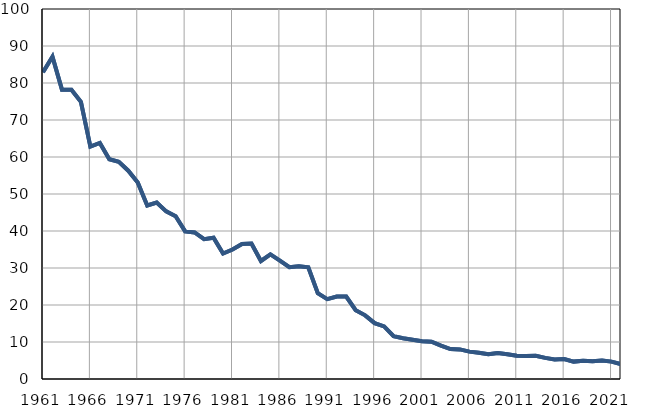
| Category |  РЕПУБЛИКА СРБИЈА |  Република Србија |
|---|---|---|
| 1961.0 | 82.9 | 82.9 |
| 1962.0 | 87.1 | 87.1 |
| 1963.0 | 78.2 | 78.2 |
| 1964.0 | 78.2 | 78.2 |
| 1965.0 | 74.9 | 74.9 |
| 1966.0 | 62.8 | 62.8 |
| 1967.0 | 63.8 | 63.8 |
| 1968.0 | 59.4 | 59.4 |
| 1969.0 | 58.7 | 58.7 |
| 1970.0 | 56.3 | 56.3 |
| 1971.0 | 53.1 | 53.1 |
| 1972.0 | 46.9 | 46.9 |
| 1973.0 | 47.7 | 47.7 |
| 1974.0 | 45.3 | 45.3 |
| 1975.0 | 44 | 44 |
| 1976.0 | 39.9 | 39.9 |
| 1977.0 | 39.6 | 39.6 |
| 1978.0 | 37.8 | 37.8 |
| 1979.0 | 38.2 | 38.2 |
| 1980.0 | 33.9 | 33.9 |
| 1981.0 | 35 | 35 |
| 1982.0 | 36.5 | 36.5 |
| 1983.0 | 36.6 | 36.6 |
| 1984.0 | 31.9 | 31.9 |
| 1985.0 | 33.7 | 33.7 |
| 1986.0 | 32 | 32 |
| 1987.0 | 30.2 | 30.2 |
| 1988.0 | 30.5 | 30.5 |
| 1989.0 | 30.2 | 30.2 |
| 1990.0 | 23.2 | 23.2 |
| 1991.0 | 21.6 | 21.6 |
| 1992.0 | 22.3 | 22.3 |
| 1993.0 | 22.3 | 22.3 |
| 1994.0 | 18.6 | 18.6 |
| 1995.0 | 17.2 | 17.2 |
| 1996.0 | 15.1 | 15.1 |
| 1997.0 | 14.2 | 14.2 |
| 1998.0 | 11.6 | 11.6 |
| 1999.0 | 11 | 11 |
| 2000.0 | 10.6 | 10.6 |
| 2001.0 | 10.2 | 10.2 |
| 2002.0 | 10.1 | 10.1 |
| 2003.0 | 9 | 9 |
| 2004.0 | 8.1 | 8.1 |
| 2005.0 | 8 | 8 |
| 2006.0 | 7.4 | 7.4 |
| 2007.0 | 7.1 | 7.1 |
| 2008.0 | 6.7 | 6.7 |
| 2009.0 | 7 | 7 |
| 2010.0 | 6.7 | 6.7 |
| 2011.0 | 6.3 | 6.3 |
| 2012.0 | 6.2 | 6.2 |
| 2013.0 | 6.3 | 6.3 |
| 2014.0 | 5.7 | 5.7 |
| 2015.0 | 5.3 | 5.3 |
| 2016.0 | 5.4 | 5.4 |
| 2017.0 | 4.7 | 4.7 |
| 2018.0 | 4.9 | 4.9 |
| 2019.0 | 4.8 | 4.8 |
| 2020.0 | 5 | 5 |
| 2021.0 | 4.7 | 4.7 |
| 2022.0 | 4 | 4 |